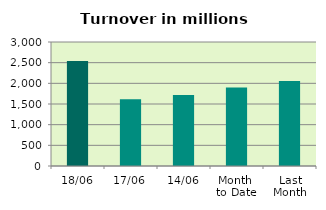
| Category | Series 0 |
|---|---|
| 18/06 | 2540.089 |
| 17/06 | 1613.731 |
| 14/06 | 1714.81 |
| Month 
to Date | 1897.602 |
| Last
Month | 2056.808 |